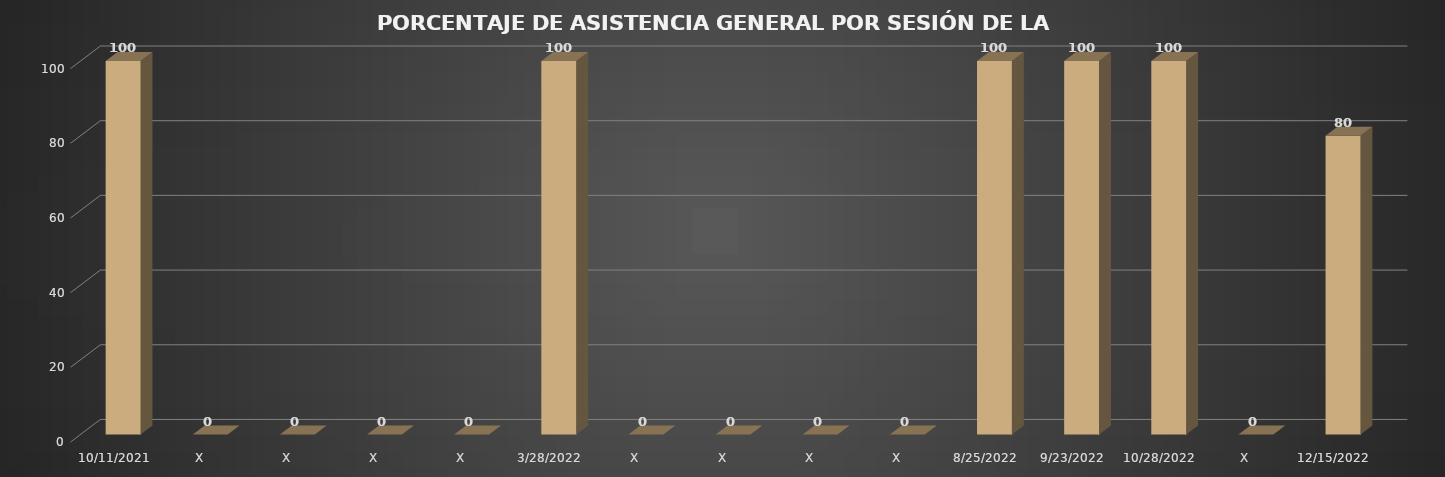
| Category | Series 0 |
|---|---|
| 11/10/2021 | 100 |
| X | 0 |
| X | 0 |
| X | 0 |
| X | 0 |
| 28/03/2022 | 100 |
| X | 0 |
| X | 0 |
| X | 0 |
| X | 0 |
| 25/08/2022 | 100 |
| 23/09/2022 | 100 |
| 28/10/2022 | 100 |
| X | 0 |
| 15/12/2022 | 80 |